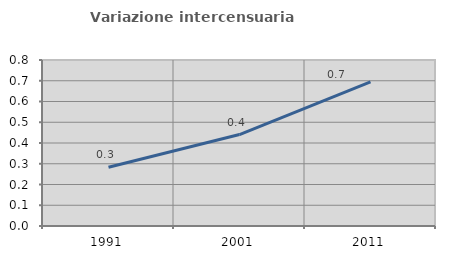
| Category | Variazione intercensuaria annua |
|---|---|
| 1991.0 | 0.283 |
| 2001.0 | 0.441 |
| 2011.0 | 0.695 |